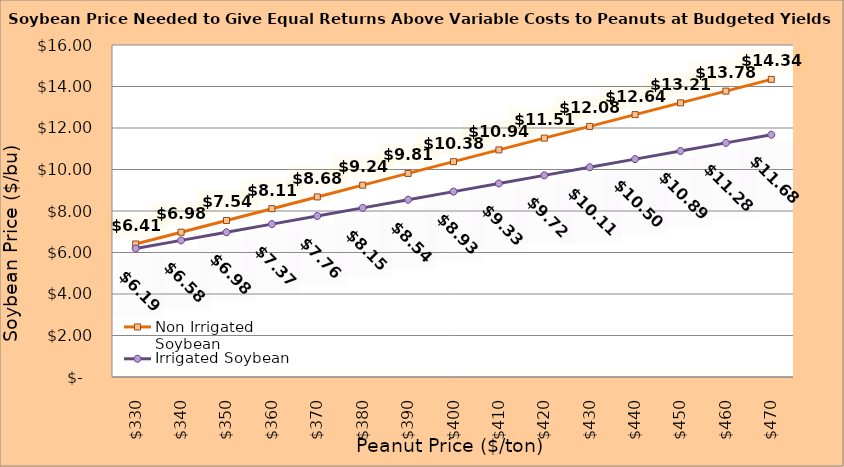
| Category | Non Irrigated Soybean | Irrigated Soybean |
|---|---|---|
| 330.0 | 6.412 | 6.193 |
| 340.0 | 6.978 | 6.584 |
| 350.0 | 7.545 | 6.976 |
| 360.0 | 8.112 | 7.368 |
| 370.0 | 8.678 | 7.759 |
| 380.0 | 9.245 | 8.151 |
| 390.0 | 9.812 | 8.543 |
| 400.0 | 10.378 | 8.934 |
| 410.0 | 10.945 | 9.326 |
| 420.0 | 11.512 | 9.718 |
| 430.0 | 12.078 | 10.109 |
| 440.0 | 12.645 | 10.501 |
| 450.0 | 13.212 | 10.893 |
| 460.0 | 13.778 | 11.284 |
| 470.0 | 14.345 | 11.676 |